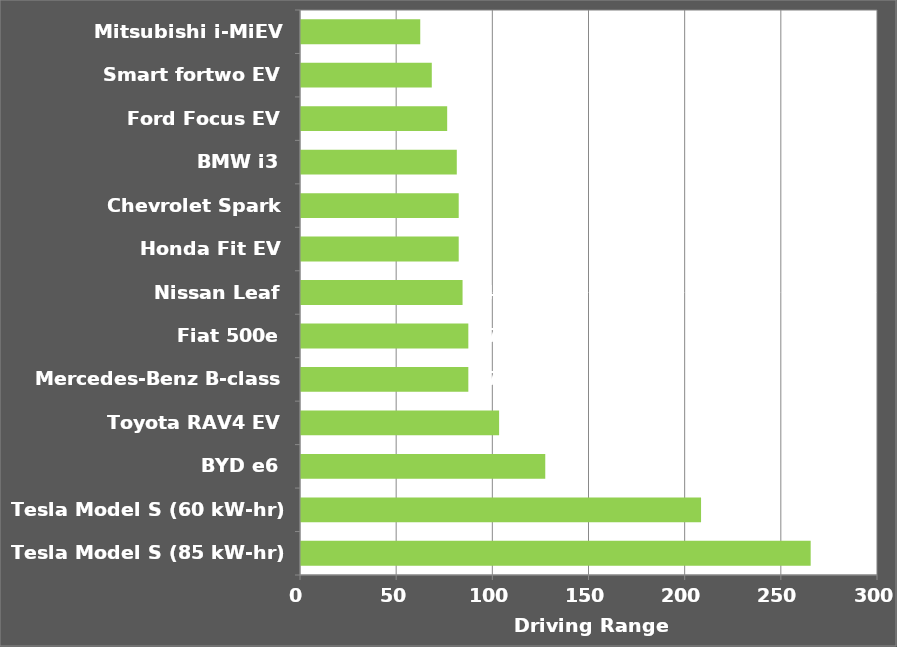
| Category | Series 0 |
|---|---|
| Tesla Model S (85 kW-hr) | 265 |
| Tesla Model S (60 kW-hr) | 208 |
| BYD e6 | 127 |
| Toyota RAV4 EV | 103 |
| Mercedes-Benz B-class | 87 |
| Fiat 500e | 87 |
| Nissan Leaf | 84 |
| Honda Fit EV | 82 |
| Chevrolet Spark | 82 |
| BMW i3 | 81 |
| Ford Focus EV | 76 |
| Smart fortwo EV | 68 |
| Mitsubishi i-MiEV | 62 |